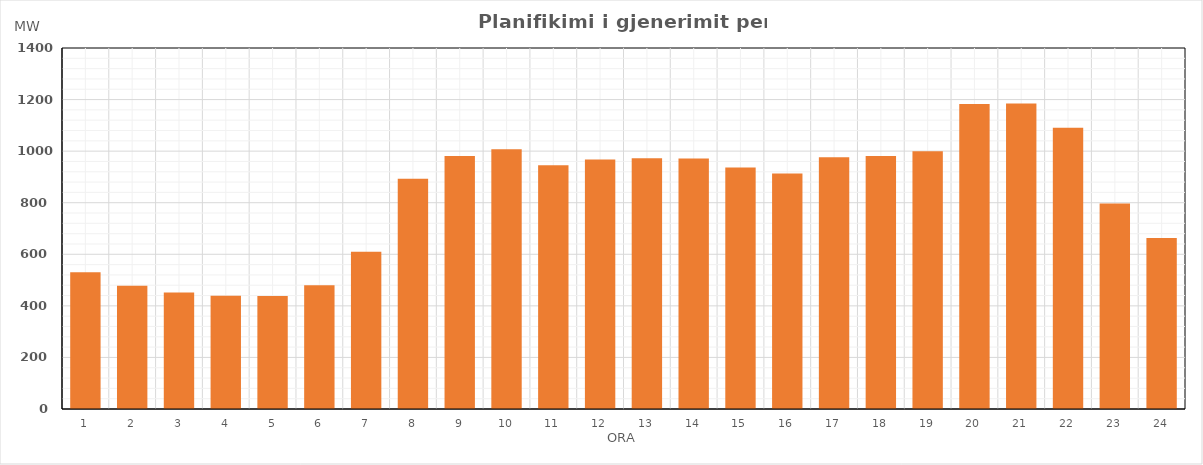
| Category | Max (MW) |
|---|---|
| 0 | 530.15 |
| 1 | 478.1 |
| 2 | 452.12 |
| 3 | 439.16 |
| 4 | 438.08 |
| 5 | 479.95 |
| 6 | 610.02 |
| 7 | 893.1 |
| 8 | 981.09 |
| 9 | 1007.17 |
| 10 | 945.18 |
| 11 | 967.13 |
| 12 | 972.06 |
| 13 | 971.23 |
| 14 | 937.02 |
| 15 | 913.09 |
| 16 | 976.05 |
| 17 | 981.22 |
| 18 | 999.18 |
| 19 | 1182.46 |
| 20 | 1184.36 |
| 21 | 1090.28 |
| 22 | 797.1 |
| 23 | 663.17 |